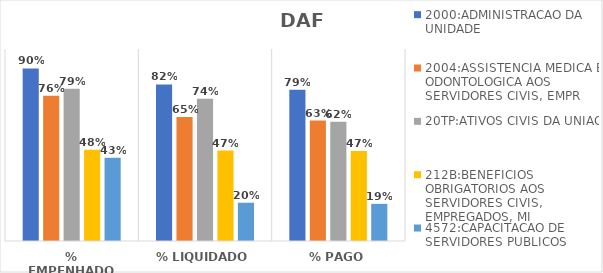
| Category | 2000:ADMINISTRACAO DA UNIDADE | 2004:ASSISTENCIA MEDICA E ODONTOLOGICA AOS SERVIDORES CIVIS, EMPR | 20TP:ATIVOS CIVIS DA UNIAO | 212B:BENEFICIOS OBRIGATORIOS AOS SERVIDORES CIVIS, EMPREGADOS, MI | 4572:CAPACITACAO DE SERVIDORES PUBLICOS FEDERAIS EM PROCESSO DE Q |
|---|---|---|---|---|---|
| % EMPENHADO | 0.899 | 0.757 | 0.793 | 0.476 | 0.434 |
| % LIQUIDADO | 0.815 | 0.646 | 0.741 | 0.471 | 0.199 |
| % PAGO | 0.787 | 0.627 | 0.621 | 0.469 | 0.194 |